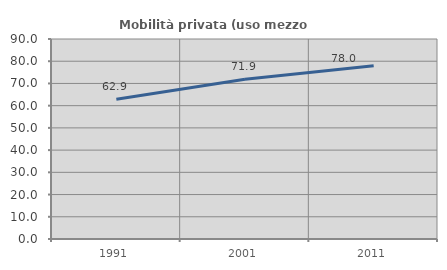
| Category | Mobilità privata (uso mezzo privato) |
|---|---|
| 1991.0 | 62.889 |
| 2001.0 | 71.932 |
| 2011.0 | 77.968 |